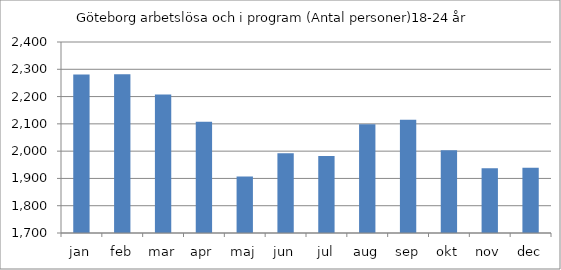
| Category | Göteborg |
|---|---|
| jan | 2281 |
| feb | 2282 |
| mar | 2208 |
| apr | 2108 |
| maj | 1907 |
| jun | 1992 |
| jul | 1982 |
| aug | 2099 |
| sep | 2115 |
| okt | 2003 |
| nov | 1937 |
| dec | 1939 |